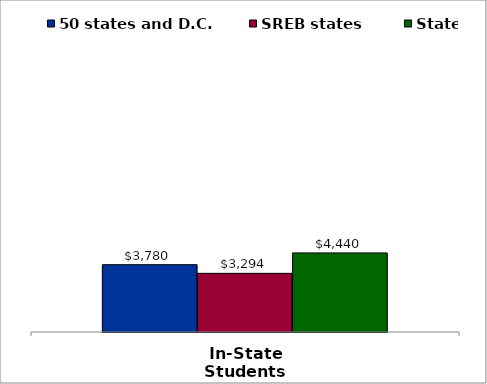
| Category | 50 states and D.C. | SREB states | State |
|---|---|---|---|
| In-State Students | 3779.5 | 3294 | 4440 |